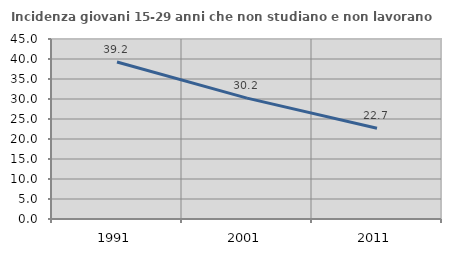
| Category | Incidenza giovani 15-29 anni che non studiano e non lavorano  |
|---|---|
| 1991.0 | 39.241 |
| 2001.0 | 30.224 |
| 2011.0 | 22.675 |